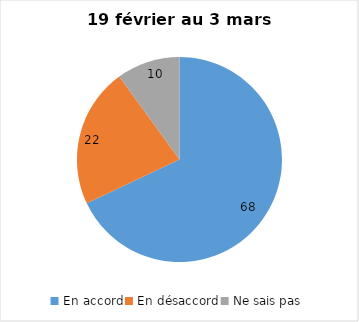
| Category | Series 0 |
|---|---|
| En accord | 68 |
| En désaccord | 22 |
| Ne sais pas | 10 |